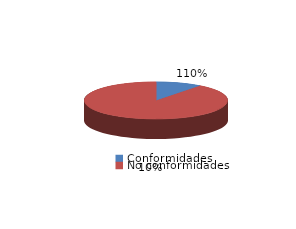
| Category | Series 0 |
|---|---|
| Conformidades | 435 |
| No conformidades | -41 |